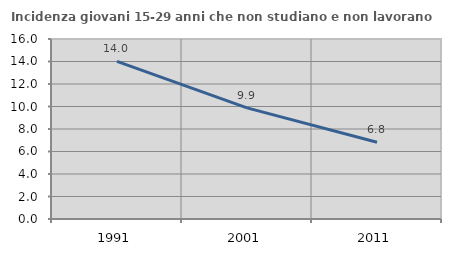
| Category | Incidenza giovani 15-29 anni che non studiano e non lavorano  |
|---|---|
| 1991.0 | 14.01 |
| 2001.0 | 9.877 |
| 2011.0 | 6.818 |